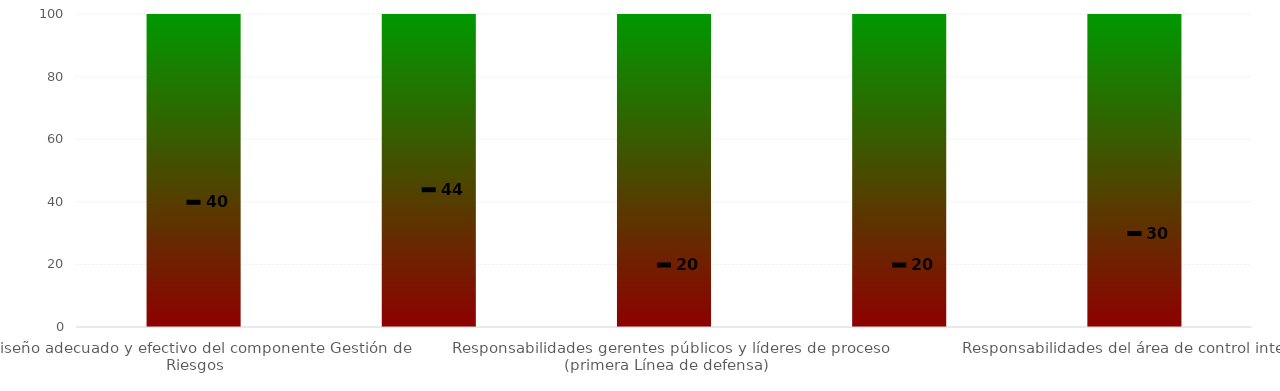
| Category | Niveles |
|---|---|
| Diseño adecuado y efectivo del componente Gestión de Riesgos | 100 |
| Responsabilidades de la Alta dirección y Comité Institucional de Coordinación de Control Interno (línea estratégica) | 100 |
| Responsabilidades gerentes públicos y líderes de proceso (primera Línea de defensa) | 100 |
| Responsabilidades de los servidores encargados del monitoreo y evaluación de controles y gestión del riesgo (segunda línea de defensa) | 100 |
| Responsabilidades del área de control interno | 100 |